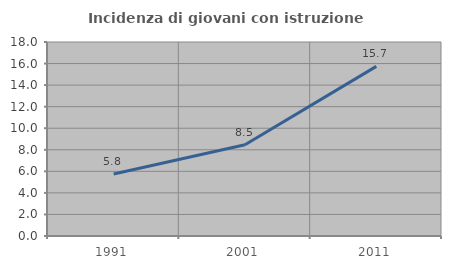
| Category | Incidenza di giovani con istruzione universitaria |
|---|---|
| 1991.0 | 5.76 |
| 2001.0 | 8.469 |
| 2011.0 | 15.739 |